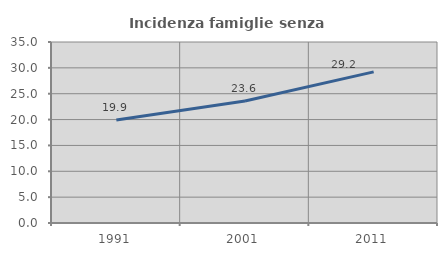
| Category | Incidenza famiglie senza nuclei |
|---|---|
| 1991.0 | 19.928 |
| 2001.0 | 23.596 |
| 2011.0 | 29.218 |